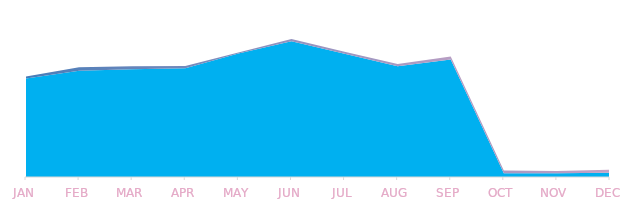
| Category | Sum of INCOMES | Sum of TOTAL 
EXPENSES |
|---|---|---|
| JAN | 206510000 | 3954612 |
| FEB | 222890000 | 7057927 |
| MAR | 225570000 | 6704737 |
| APR | 228010000 | 4530205 |
| MAY | 258760000 | 2369021 |
| JUN | 284360000 | 5044924 |
| JUL | 258080000 | 4657321 |
| AUG | 231990000 | 5065403 |
| SEP | 246490000 | 6244460 |
| OCT | 8070000 | 5704531 |
| NOV | 8070000 | 4522707 |
| DEC | 9160000 | 6292008 |